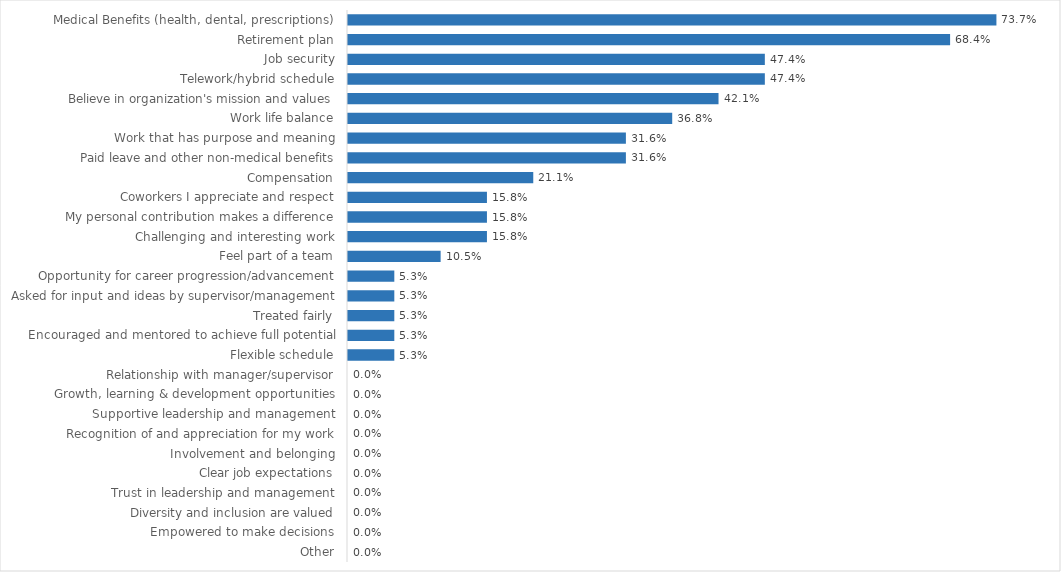
| Category | Natural Resources Board |
|---|---|
| Medical Benefits (health, dental, prescriptions) | 0.737 |
| Retirement plan | 0.684 |
| Job security | 0.474 |
| Telework/hybrid schedule | 0.474 |
| Believe in organization's mission and values | 0.421 |
| Work life balance | 0.368 |
| Work that has purpose and meaning | 0.316 |
| Paid leave and other non-medical benefits | 0.316 |
| Compensation | 0.211 |
| Coworkers I appreciate and respect | 0.158 |
| My personal contribution makes a difference | 0.158 |
| Challenging and interesting work | 0.158 |
| Feel part of a team | 0.105 |
| Opportunity for career progression/advancement | 0.053 |
| Asked for input and ideas by supervisor/management | 0.053 |
| Treated fairly | 0.053 |
| Encouraged and mentored to achieve full potential | 0.053 |
| Flexible schedule | 0.053 |
| Relationship with manager/supervisor | 0 |
| Growth, learning & development opportunities | 0 |
| Supportive leadership and management | 0 |
| Recognition of and appreciation for my work | 0 |
| Involvement and belonging | 0 |
| Clear job expectations | 0 |
| Trust in leadership and management | 0 |
| Diversity and inclusion are valued | 0 |
| Empowered to make decisions | 0 |
| Other | 0 |